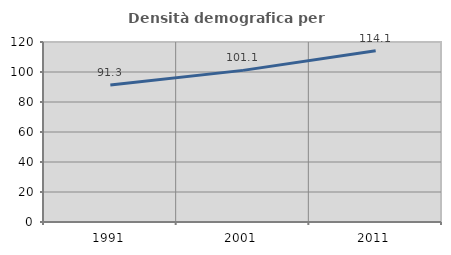
| Category | Densità demografica |
|---|---|
| 1991.0 | 91.343 |
| 2001.0 | 101.079 |
| 2011.0 | 114.137 |